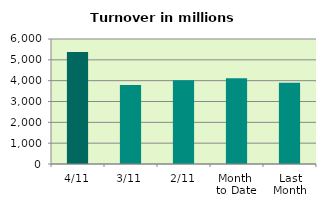
| Category | Series 0 |
|---|---|
| 4/11 | 5376.823 |
| 3/11 | 3797.837 |
| 2/11 | 4023.998 |
| Month 
to Date | 4118.343 |
| Last
Month | 3895.685 |